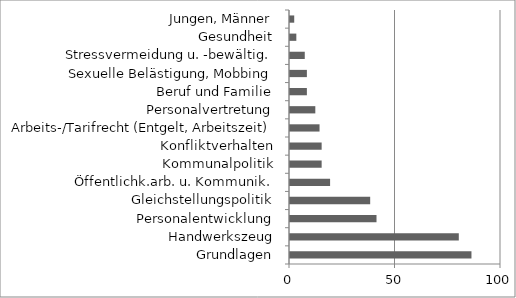
| Category | Series 0 |
|---|---|
| Grundlagen | 86 |
| Handwerkszeug | 80 |
| Personalentwicklung | 41 |
| Gleichstellungspolitik | 38 |
| Öffentlichk.arb. u. Kommunik. | 19 |
| Kommunalpolitik | 15 |
| Konfliktverhalten | 15 |
| Arbeits-/Tarifrecht (Entgelt, Arbeitszeit) | 14 |
| Personalvertretung | 12 |
| Beruf und Familie | 8 |
| Sexuelle Belästigung, Mobbing | 8 |
| Stressvermeidung u. -bewältig. | 7 |
| Gesundheit | 3 |
| Jungen, Männer | 2 |